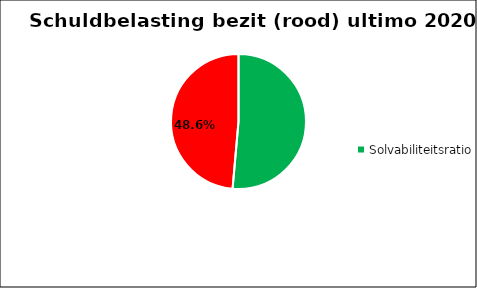
| Category | solvabiliteitsratio |
|---|---|
| Solvabiliteitsratio ultimo 2020 | 0.514 |